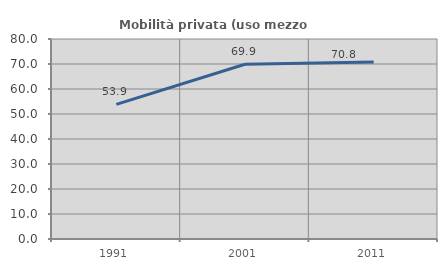
| Category | Mobilità privata (uso mezzo privato) |
|---|---|
| 1991.0 | 53.873 |
| 2001.0 | 69.917 |
| 2011.0 | 70.811 |